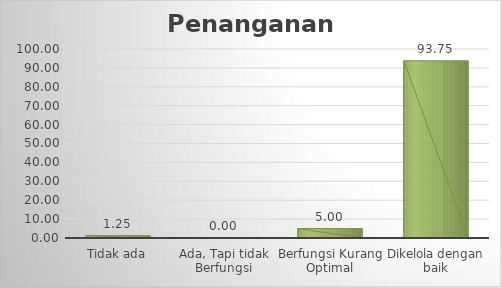
| Category | Kualitas Sarana dan Prasarana |
|---|---|
| Tidak ada | 1.25 |
| Ada, Tapi tidak Berfungsi | 0 |
| Berfungsi Kurang Optimal | 5 |
| Dikelola dengan baik | 93.75 |